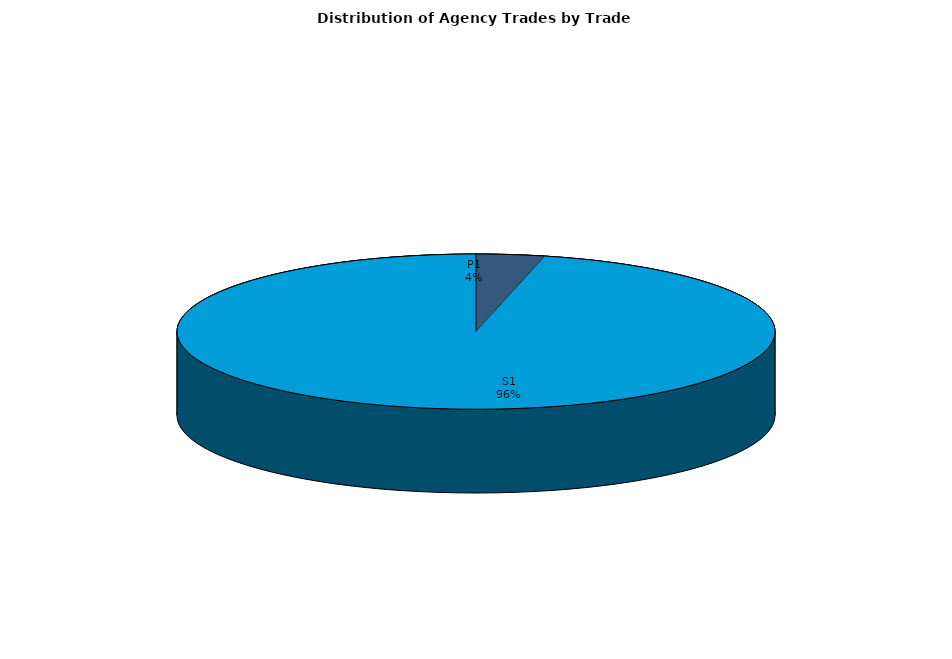
| Category | Series 0 |
|---|---|
| P1 | 65.933 |
| S1 | 1714.194 |